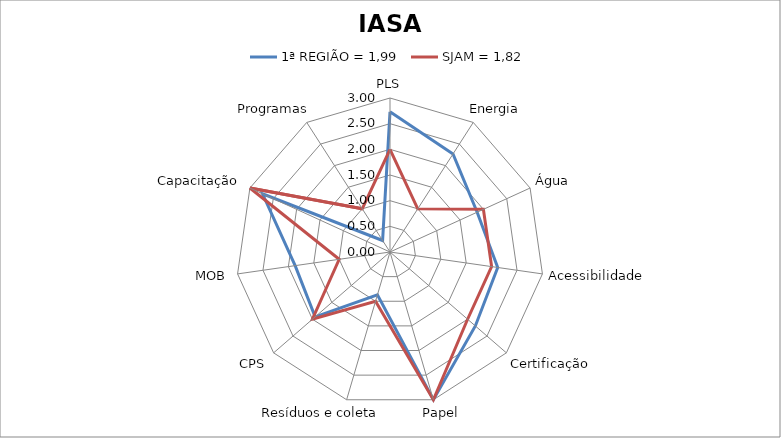
| Category | 1ª REGIÃO = 1,99 | SJAM = 1,82 |
|---|---|---|
| PLS | 2.73 | 2 |
| Energia | 2.27 | 1 |
| Água | 1.867 | 2 |
| Acessibilidade | 2.12 | 2 |
| Certificação | 2.2 | 2 |
| Papel | 3 | 3 |
| Resíduos e coleta | 0.87 | 1 |
| CPS | 1.93 | 2 |
| MOB | 1.867 | 1 |
| Capacitação | 2.73 | 3 |
| Programas | 0.267 | 1 |